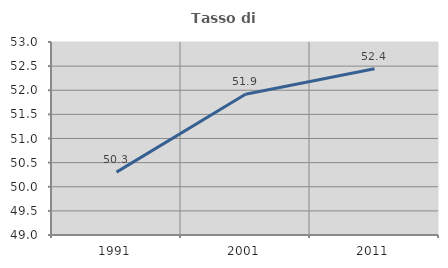
| Category | Tasso di occupazione   |
|---|---|
| 1991.0 | 50.303 |
| 2001.0 | 51.918 |
| 2011.0 | 52.447 |